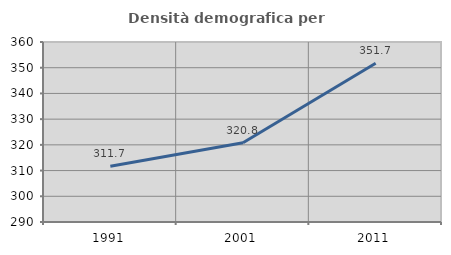
| Category | Densità demografica |
|---|---|
| 1991.0 | 311.719 |
| 2001.0 | 320.807 |
| 2011.0 | 351.706 |